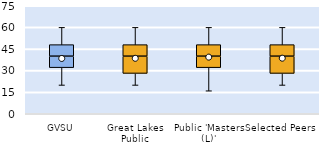
| Category | 25th | 50th | 75th |
|---|---|---|---|
| GVSU | 32 | 8 | 8 |
| Great Lakes Public | 28 | 12 | 8 |
| Public 'Masters (L)' | 32 | 8 | 8 |
| Selected Peers | 28 | 12 | 8 |